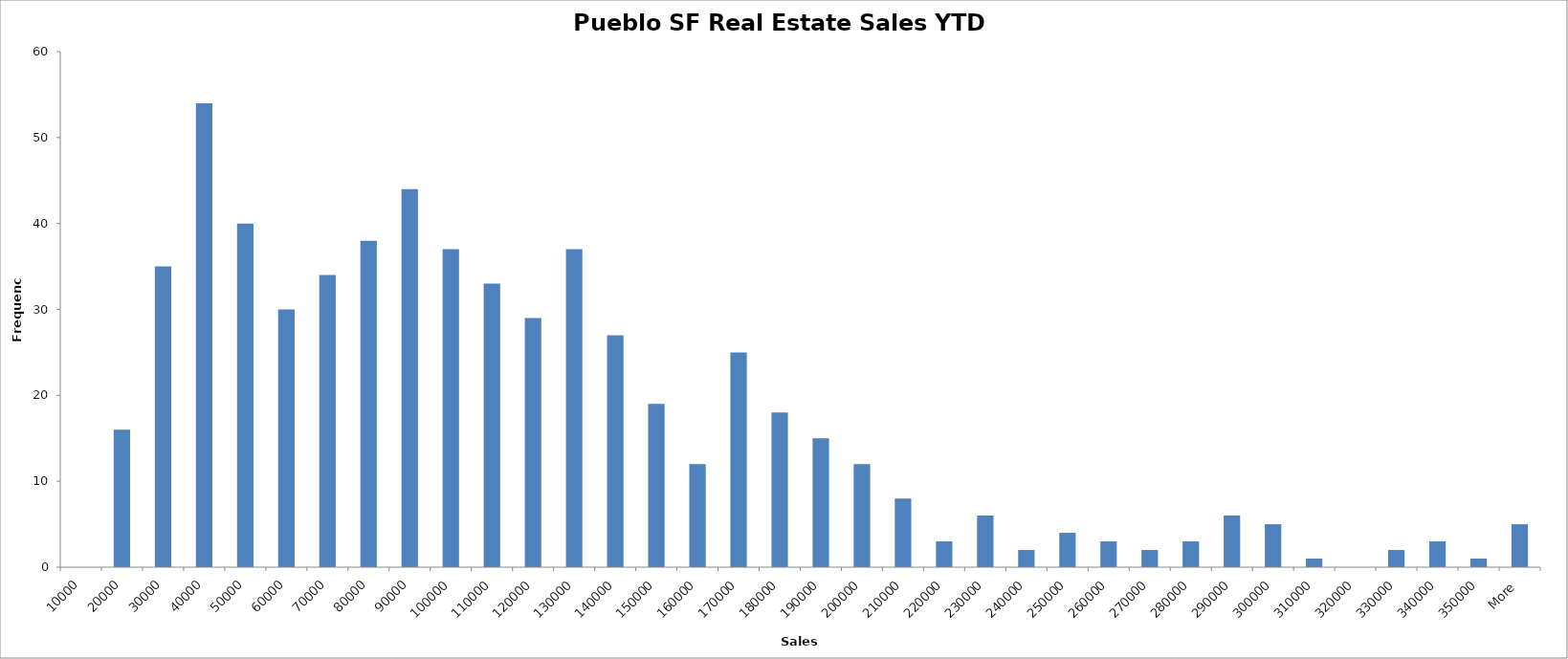
| Category | Frequency |
|---|---|
| 10000 | 0 |
| 20000 | 16 |
| 30000 | 35 |
| 40000 | 54 |
| 50000 | 40 |
| 60000 | 30 |
| 70000 | 34 |
| 80000 | 38 |
| 90000 | 44 |
| 100000 | 37 |
| 110000 | 33 |
| 120000 | 29 |
| 130000 | 37 |
| 140000 | 27 |
| 150000 | 19 |
| 160000 | 12 |
| 170000 | 25 |
| 180000 | 18 |
| 190000 | 15 |
| 200000 | 12 |
| 210000 | 8 |
| 220000 | 3 |
| 230000 | 6 |
| 240000 | 2 |
| 250000 | 4 |
| 260000 | 3 |
| 270000 | 2 |
| 280000 | 3 |
| 290000 | 6 |
| 300000 | 5 |
| 310000 | 1 |
| 320000 | 0 |
| 330000 | 2 |
| 340000 | 3 |
| 350000 | 1 |
| More | 5 |